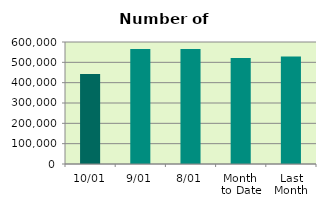
| Category | Series 0 |
|---|---|
| 10/01 | 443182 |
| 9/01 | 565500 |
| 8/01 | 565674 |
| Month 
to Date | 520884.571 |
| Last
Month | 528134.632 |